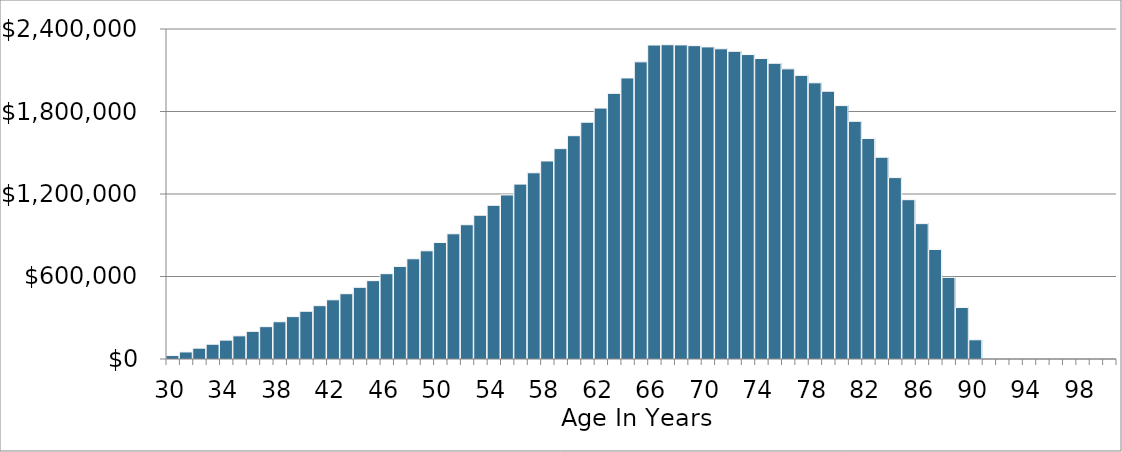
| Category | Untitled 1 |
|---|---|
| 30 | 25080 |
| 31 | 51288.6 |
| 32 | 78676.587 |
| 33 | 107297.033 |
| 34 | 137205.4 |
| 35 | 168459.643 |
| 36 | 201120.327 |
| 37 | 235250.742 |
| 38 | 270917.025 |
| 39 | 308188.291 |
| 40 | 347136.764 |
| 41 | 387837.919 |
| 42 | 430370.625 |
| 43 | 474817.303 |
| 44 | 521264.082 |
| 45 | 569800.965 |
| 46 | 620522.009 |
| 47 | 673525.499 |
| 48 | 728914.147 |
| 49 | 786795.283 |
| 50 | 847281.071 |
| 51 | 910488.719 |
| 52 | 976540.711 |
| 53 | 1045565.043 |
| 54 | 1117695.47 |
| 55 | 1193071.767 |
| 56 | 1271839.996 |
| 57 | 1354152.796 |
| 58 | 1440169.672 |
| 59 | 1530057.307 |
| 60 | 1623989.886 |
| 61 | 1722149.431 |
| 62 | 1824726.155 |
| 63 | 1931918.832 |
| 64 | 2043935.179 |
| 65 | 2160992.263 |
| 66 | 2283316.914 |
| 67 | 2285585.859 |
| 68 | 2284263.018 |
| 69 | 2279088.504 |
| 70 | 2269788.251 |
| 71 | 2256073.308 |
| 72 | 2237639.112 |
| 73 | 2214164.716 |
| 74 | 2185311.985 |
| 75 | 2150724.757 |
| 76 | 2110027.956 |
| 77 | 2062826.672 |
| 78 | 2008705.196 |
| 79 | 1947226.003 |
| 80 | 1842954.698 |
| 81 | 1728632.202 |
| 82 | 1603669.43 |
| 83 | 1467447.354 |
| 84 | 1319315.568 |
| 85 | 1158590.794 |
| 86 | 984555.306 |
| 87 | 796455.29 |
| 88 | 593499.126 |
| 89 | 374855.589 |
| 90 | 139651.967 |
| 91 | 0 |
| 92 | 0 |
| 93 | 0 |
| 94 | 0 |
| 95 | 0 |
| 96 | 0 |
| 97 | 0 |
| 98 | 0 |
| 99 | 0 |
| 100 | 0 |